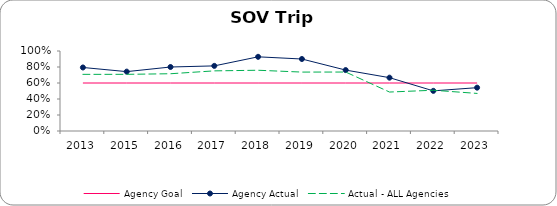
| Category | Agency Goal | Agency Actual | Actual - ALL Agencies |
|---|---|---|---|
| 2013.0 | 0.6 | 0.794 | 0.708 |
| 2015.0 | 0.6 | 0.742 | 0.708 |
| 2016.0 | 0.6 | 0.8 | 0.716 |
| 2017.0 | 0.6 | 0.814 | 0.752 |
| 2018.0 | 0.6 | 0.927 | 0.759 |
| 2019.0 | 0.6 | 0.9 | 0.736 |
| 2020.0 | 0.6 | 0.762 | 0.737 |
| 2021.0 | 0.6 | 0.667 | 0.487 |
| 2022.0 | 0.6 | 0.502 | 0.509 |
| 2023.0 | 0.6 | 0.542 | 0.47 |